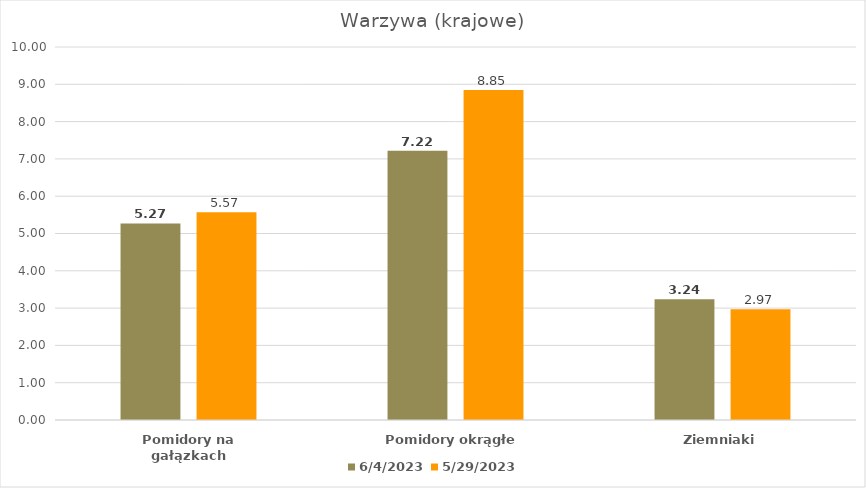
| Category | 2023-06-04 | 2023-05-29 |
|---|---|---|
| Pomidory na gałązkach | 5.27 | 5.57 |
| Pomidory okrągłe | 7.22 | 8.85 |
| Ziemniaki | 3.24 | 2.97 |